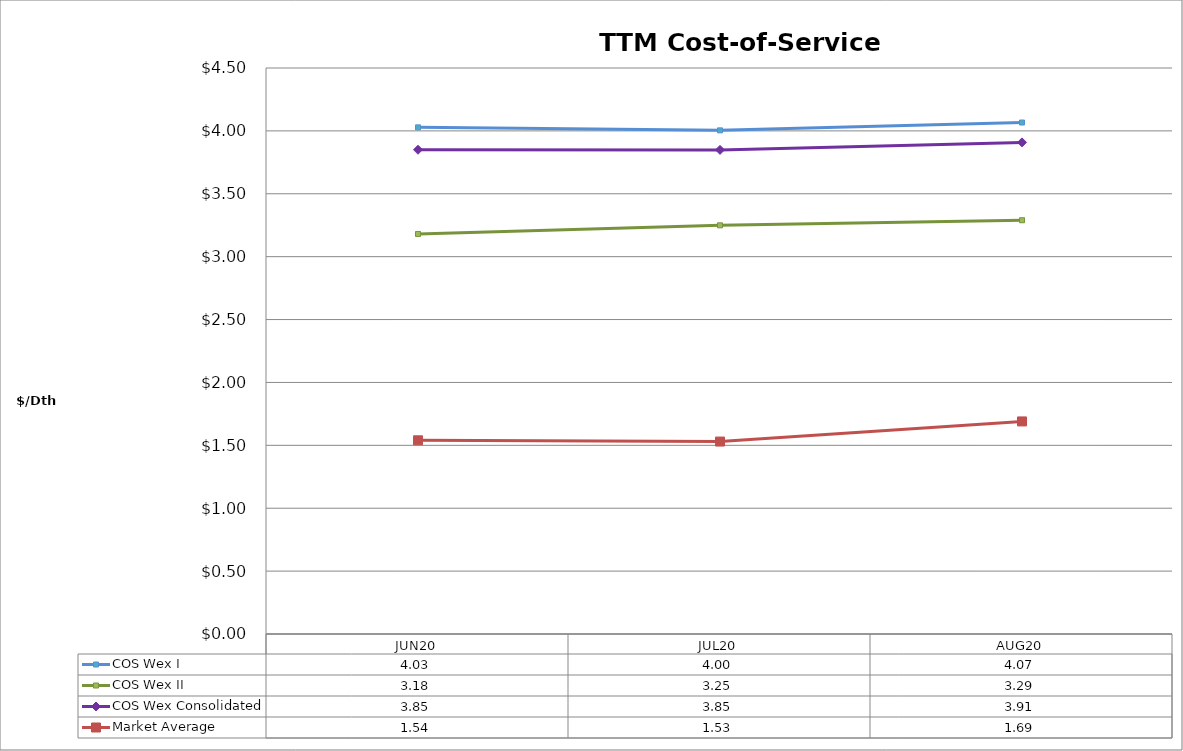
| Category | COS Wex I | COS Wex II | COS Wex Consolidated | Market Average |
|---|---|---|---|---|
| JUN20 | 4.028 | 3.181 | 3.85 | 1.54 |
| JUL20 | 4.004 | 3.249 | 3.849 | 1.53 |
| AUG20 | 4.066 | 3.29 | 3.909 | 1.69 |